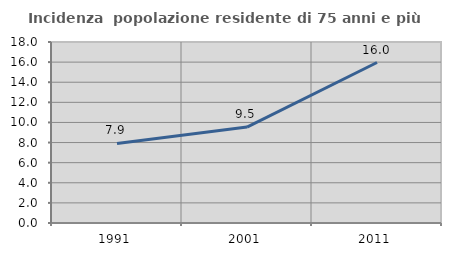
| Category | Incidenza  popolazione residente di 75 anni e più |
|---|---|
| 1991.0 | 7.911 |
| 2001.0 | 9.539 |
| 2011.0 | 15.961 |